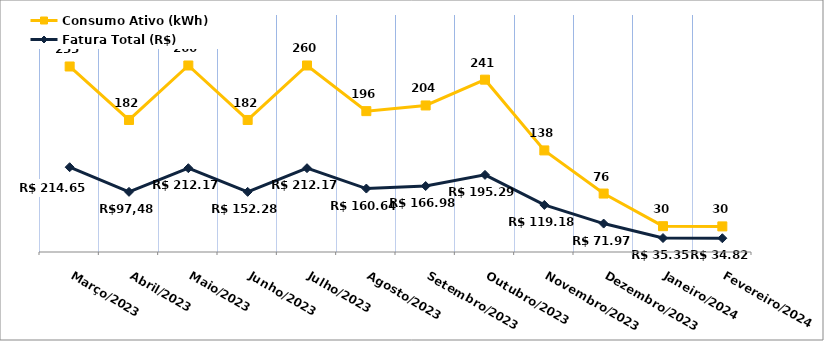
| Category | Fatura Total (R$) | Consumo Ativo (kWh) |
|---|---|---|
| Março/2023 | 214.65 | 255 |
| Abril/2023 | 152.28 | 182 |
| Maio/2023 | 212.17 | 260 |
| Junho/2023 | 152.28 | 182 |
| Julho/2023 | 212.17 | 260 |
| Agosto/2023 | 160.64 | 196 |
| Setembro/2023 | 166.98 | 204 |
| Outubro/2023 | 195.29 | 241 |
| Novembro/2023 | 119.18 | 138 |
| Dezembro/2023 | 71.97 | 76 |
| Janeiro/2024 | 35.35 | 30 |
| Fevereiro/2024 | 34.82 | 30 |